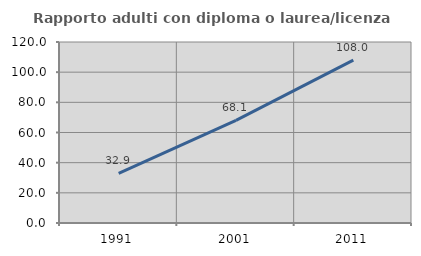
| Category | Rapporto adulti con diploma o laurea/licenza media  |
|---|---|
| 1991.0 | 32.857 |
| 2001.0 | 68.063 |
| 2011.0 | 108 |